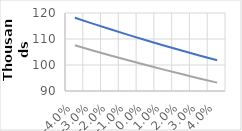
| Category | Ertragswert | Marktwert |
|---|---|---|
| -0.04 | 118183.673 | 107581.33 |
| -0.03 | 115921.592 | 105604.883 |
| -0.02 | 113725.49 | 103683.876 |
| -0.01 | 111592.81 | 101816.239 |
| 0.0 | 109521.116 | 100000 |
| 0.01 | 107508.091 | 98233.276 |
| 0.02 | 105551.524 | 96514.271 |
| 0.03 | 103649.31 | 94841.27 |
| 0.04 | 101799.441 | 93212.633 |